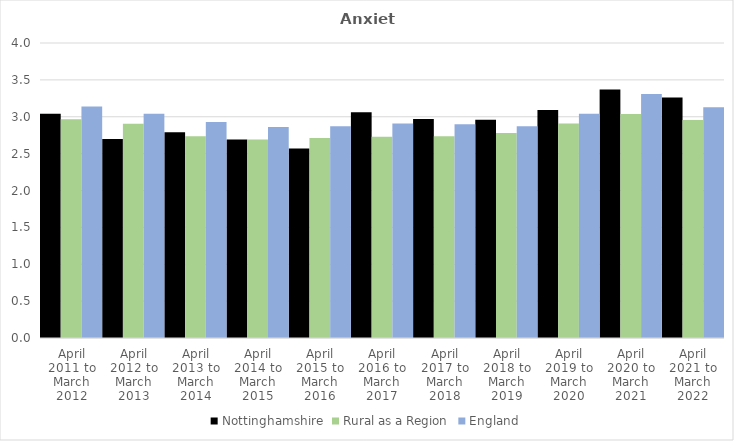
| Category | Nottinghamshire | Rural as a Region | England |
|---|---|---|---|
| April 2011 to March 2012 | 3.04 | 2.967 | 3.14 |
| April 2012 to March 2013 | 2.7 | 2.904 | 3.04 |
| April 2013 to March 2014 | 2.79 | 2.734 | 2.93 |
| April 2014 to March 2015 | 2.69 | 2.691 | 2.86 |
| April 2015 to March 2016 | 2.57 | 2.711 | 2.87 |
| April 2016 to March 2017 | 3.06 | 2.729 | 2.91 |
| April 2017 to March 2018 | 2.97 | 2.736 | 2.9 |
| April 2018 to March 2019 | 2.96 | 2.78 | 2.87 |
| April 2019 to March 2020 | 3.09 | 2.908 | 3.04 |
| April 2020 to March 2021 | 3.37 | 3.036 | 3.31 |
| April 2021 to March 2022 | 3.26 | 2.956 | 3.13 |